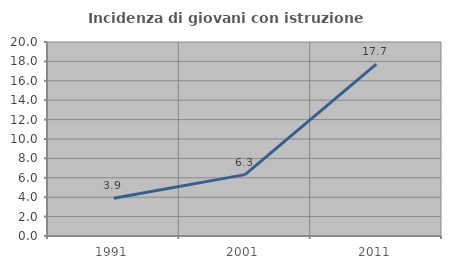
| Category | Incidenza di giovani con istruzione universitaria |
|---|---|
| 1991.0 | 3.896 |
| 2001.0 | 6.329 |
| 2011.0 | 17.722 |